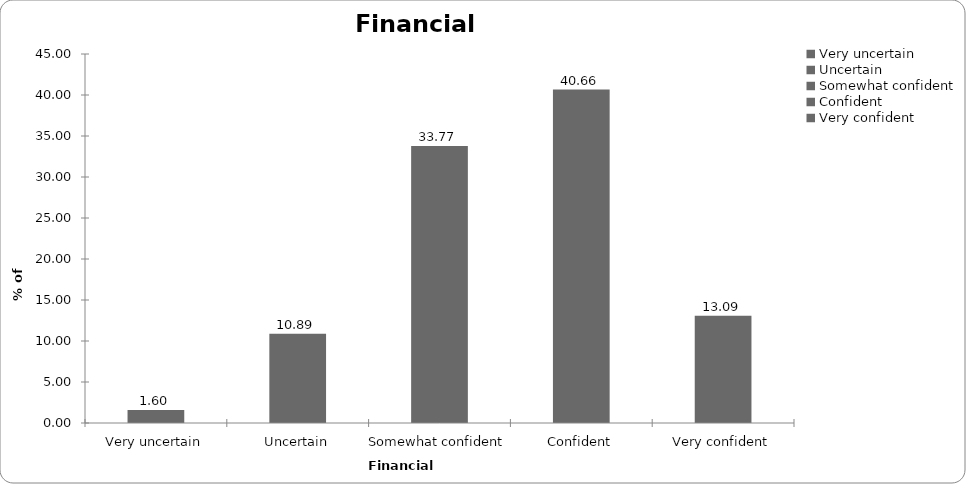
| Category | Financial confidence |
|---|---|
| Very uncertain | 1.598 |
| Uncertain | 10.889 |
| Somewhat confident | 33.766 |
| Confident | 40.659 |
| Very confident | 13.087 |